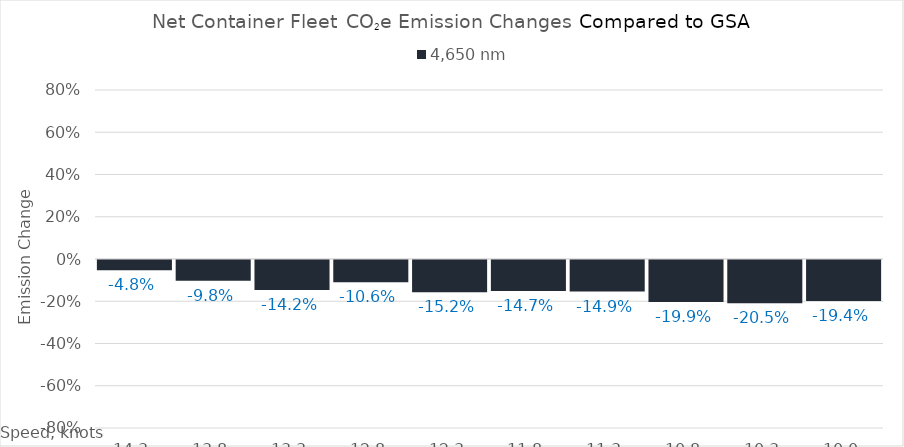
| Category | 4,650 |
|---|---|
| 14.3 | -0.048 |
| 13.8 | -0.098 |
| 13.3 | -0.142 |
| 12.8 | -0.106 |
| 12.3 | -0.152 |
| 11.8 | -0.147 |
| 11.3 | -0.149 |
| 10.8 | -0.199 |
| 10.3 | -0.205 |
| 10.0 | -0.194 |